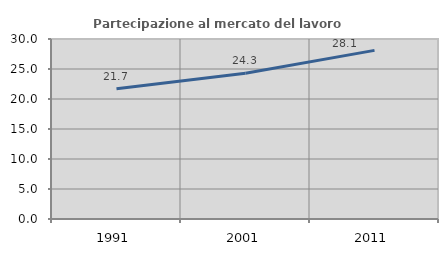
| Category | Partecipazione al mercato del lavoro  femminile |
|---|---|
| 1991.0 | 21.717 |
| 2001.0 | 24.294 |
| 2011.0 | 28.105 |